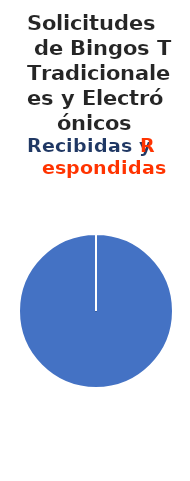
| Category | Series 0 |
|---|---|
| 0 | 47 |
| 1 | 0 |